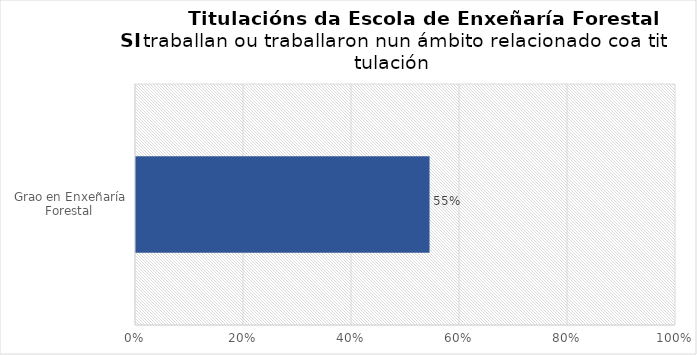
| Category | Series 0 |
|---|---|
| Grao en Enxeñaría Forestal | 0.545 |